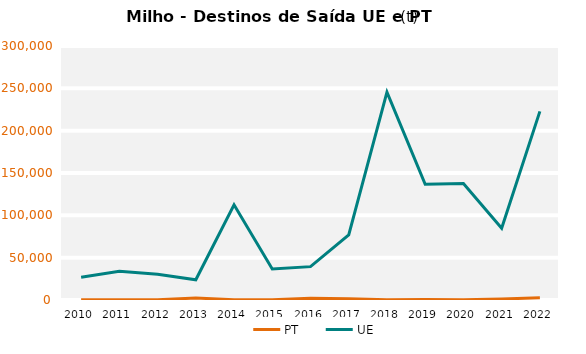
| Category | PT | UE |
|---|---|---|
| 2010.0 | 208.735 | 26981.375 |
| 2011.0 | 186.359 | 33916.02 |
| 2012.0 | 259.708 | 30462.155 |
| 2013.0 | 2311.795 | 23856.313 |
| 2014.0 | 262.24 | 112462.705 |
| 2015.0 | 203.089 | 36534.778 |
| 2016.0 | 2013.213 | 39392.016 |
| 2017.0 | 1529.796 | 76929.028 |
| 2018.0 | 392.017 | 245469.126 |
| 2019.0 | 648.158 | 136660.785 |
| 2020.0 | 229.842 | 137482.61 |
| 2021.0 | 1189.674 | 84746.59 |
| 2022.0 | 2587.651 | 222763.175 |